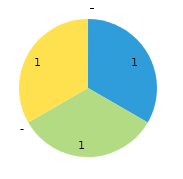
| Category | Wednesday | Department |
|---|---|---|
| 0 | 1 | 0 |
| 1 | 1 | 0 |
| 2 | 0 | 0 |
| 3 | 0 | 0 |
| 4 | 1 | 0 |
| 5 | 0 | 0 |
| 6 | 0 | 0 |
| 7 | 0 | 0 |
| 8 | 0 | 0 |
| 9 | 0 | 0 |
| 10 | 0 | 0 |
| 11 | 0 | 0 |
| 12 | 0 | 0 |
| 13 | 0 | 0 |
| 14 | 0 | 0 |
| 15 | 0 | 0 |
| 16 | 0 | 0 |
| 17 | 0 | 0 |
| 18 | 0 | 0 |
| 19 | 0 | 0 |